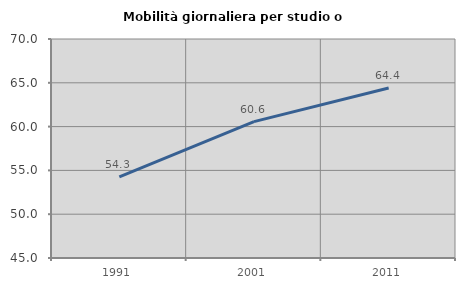
| Category | Mobilità giornaliera per studio o lavoro |
|---|---|
| 1991.0 | 54.268 |
| 2001.0 | 60.57 |
| 2011.0 | 64.408 |